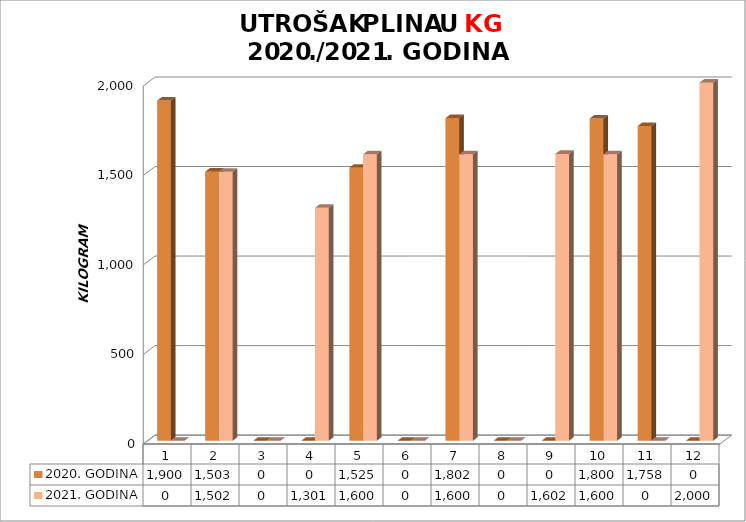
| Category | 2020. GODINA | 2021. GODINA |
|---|---|---|
| 0 | 1900 | 0 |
| 1 | 1503 | 1502 |
| 2 | 0 | 0 |
| 3 | 0 | 1301 |
| 4 | 1525 | 1600 |
| 5 | 0 | 0 |
| 6 | 1802 | 1600 |
| 7 | 0 | 0 |
| 8 | 0 | 1602 |
| 9 | 1800 | 1600 |
| 10 | 1758 | 0 |
| 11 | 0 | 2000 |